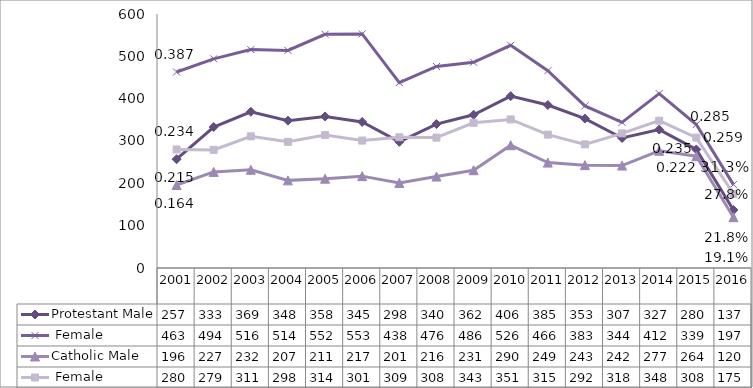
| Category | Protestant | Catholic |
|---|---|---|
| 2001.0 | 463 | 280 |
| 2002.0 | 494 | 279 |
| 2003.0 | 516 | 311 |
| 2004.0 | 514 | 298 |
| 2005.0 | 552 | 314 |
| 2006.0 | 553 | 301 |
| 2007.0 | 438 | 309 |
| 2008.0 | 476 | 308 |
| 2009.0 | 486 | 343 |
| 2010.0 | 526 | 351 |
| 2011.0 | 466 | 315 |
| 2012.0 | 383 | 292 |
| 2013.0 | 344 | 318 |
| 2014.0 | 412 | 348 |
| 2015.0 | 339 | 308 |
| 2016.0 | 197 | 175 |